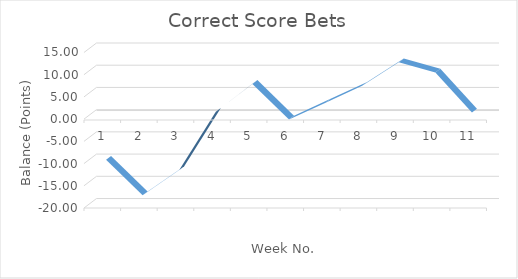
| Category | Running Total |
|---|---|
| 0 | -10 |
| 1 | -18 |
| 2 | -12.32 |
| 3 | 0.82 |
| 4 | 7.07 |
| 5 | -0.93 |
| 6 | 2.85 |
| 7 | 6.63 |
| 8 | 11.93 |
| 9 | 9.63 |
| 10 | 0.63 |